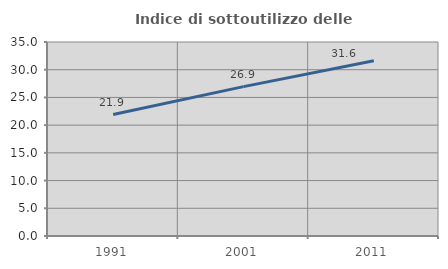
| Category | Indice di sottoutilizzo delle abitazioni  |
|---|---|
| 1991.0 | 21.912 |
| 2001.0 | 26.945 |
| 2011.0 | 31.632 |